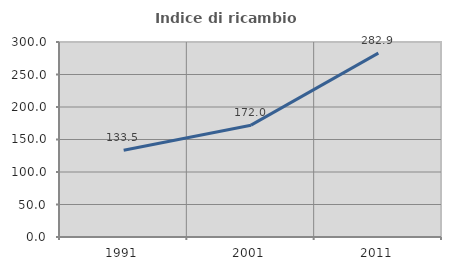
| Category | Indice di ricambio occupazionale  |
|---|---|
| 1991.0 | 133.539 |
| 2001.0 | 172.038 |
| 2011.0 | 282.859 |